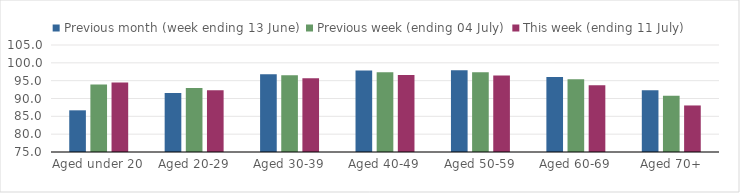
| Category | Previous month (week ending 13 June) | Previous week (ending 04 July) | This week (ending 11 July) |
|---|---|---|---|
| Aged under 20 | 86.686 | 93.914 | 94.47 |
| Aged 20-29 | 91.532 | 92.925 | 92.282 |
| Aged 30-39 | 96.832 | 96.496 | 95.704 |
| Aged 40-49 | 97.862 | 97.361 | 96.578 |
| Aged 50-59 | 97.922 | 97.377 | 96.425 |
| Aged 60-69 | 96.011 | 95.422 | 93.735 |
| Aged 70+ | 92.317 | 90.739 | 88.048 |